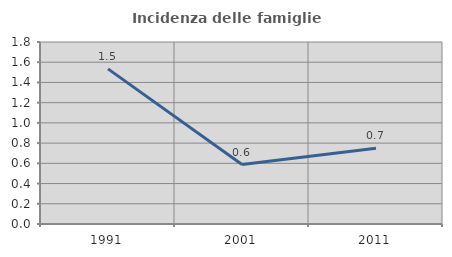
| Category | Incidenza delle famiglie numerose |
|---|---|
| 1991.0 | 1.534 |
| 2001.0 | 0.588 |
| 2011.0 | 0.75 |